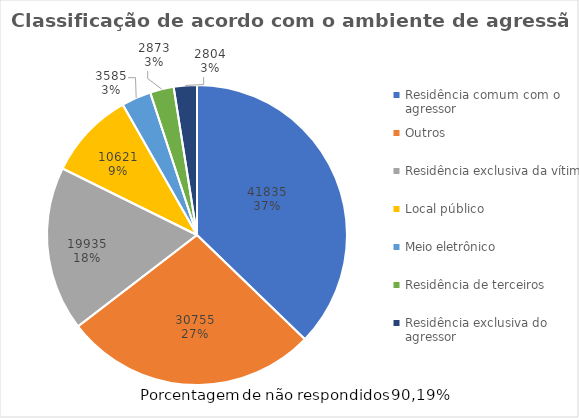
| Category | Series 0 |
|---|---|
| Residência comum com o agressor | 41835 |
| Outros | 30755 |
| Residência exclusiva da vítima | 19935 |
| Local público | 10621 |
| Meio eletrônico | 3585 |
| Residência de terceiros | 2873 |
| Residência exclusiva do agressor | 2804 |